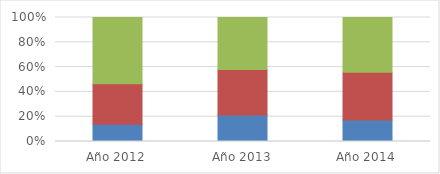
| Category | BISUTERIA | LABIAL | PERFUME |
|---|---|---|---|
| Año 2012 | 10968 | 25970 | 42458 |
| Año 2013 | 15618 | 26726 | 30458 |
| Año 2014 | 13462 | 29870 | 34256 |